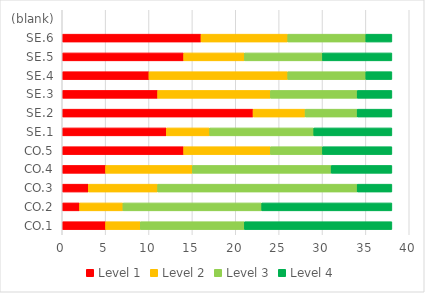
| Category | Level 1 | Level 2 | Level 3 | Level 4 |
|---|---|---|---|---|
| CO.1 | 5 | 4 | 12 | 17 |
| CO.2 | 2 | 5 | 16 | 15 |
| CO.3 | 3 | 8 | 23 | 4 |
| CO.4 | 5 | 10 | 16 | 7 |
| CO.5 | 14 | 10 | 6 | 8 |
| SE.1 | 12 | 5 | 12 | 9 |
| SE.2 | 22 | 6 | 6 | 4 |
| SE.3 | 11 | 13 | 10 | 4 |
| SE.4 | 10 | 16 | 9 | 3 |
| SE.5 | 14 | 7 | 9 | 8 |
| SE.6 | 16 | 10 | 9 | 3 |
| (blank) | 0 | 0 | 0 | 0 |